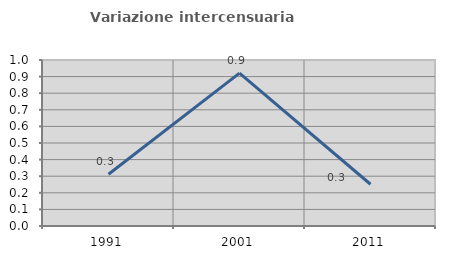
| Category | Variazione intercensuaria annua |
|---|---|
| 1991.0 | 0.312 |
| 2001.0 | 0.921 |
| 2011.0 | 0.252 |